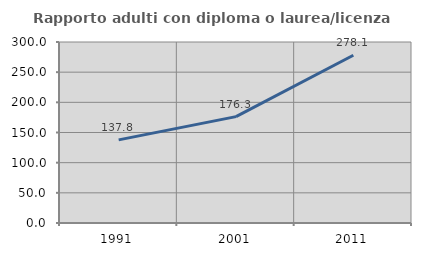
| Category | Rapporto adulti con diploma o laurea/licenza media  |
|---|---|
| 1991.0 | 137.76 |
| 2001.0 | 176.284 |
| 2011.0 | 278.09 |